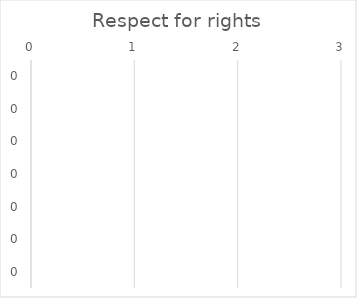
| Category | Respect for rights |
|---|---|
| 0.0 | 0 |
| 0.0 | 0 |
| 0.0 | 0 |
| 0.0 | 0 |
| 0.0 | 0 |
| 0.0 | 0 |
| 0.0 | 0 |